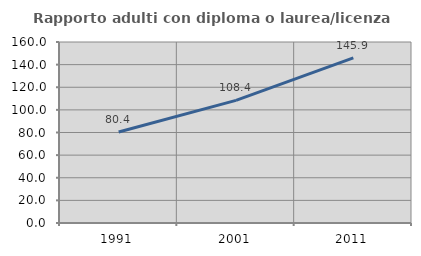
| Category | Rapporto adulti con diploma o laurea/licenza media  |
|---|---|
| 1991.0 | 80.412 |
| 2001.0 | 108.418 |
| 2011.0 | 145.897 |